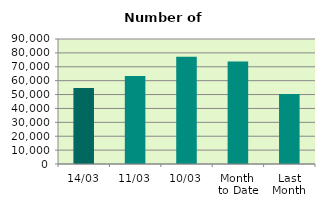
| Category | Series 0 |
|---|---|
| 14/03 | 54792 |
| 11/03 | 63414 |
| 10/03 | 77158 |
| Month 
to Date | 73809.8 |
| Last
Month | 50484.7 |